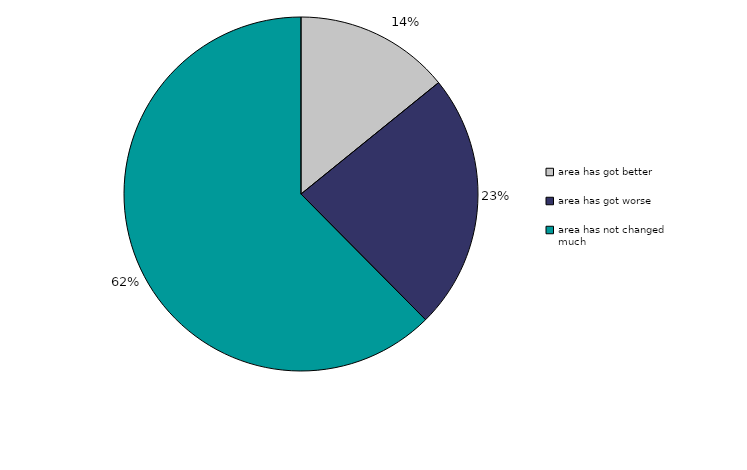
| Category | Series 0 |
|---|---|
| area has got better | 14.167 |
| area has got worse | 23.404 |
| area has not changed much | 62.429 |